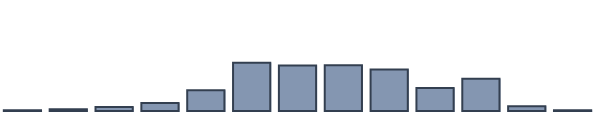
| Category | Series 0 |
|---|---|
| 0 | 0.227 |
| 1 | 0.606 |
| 2 | 1.439 |
| 3 | 2.879 |
| 4 | 7.5 |
| 5 | 17.424 |
| 6 | 16.439 |
| 7 | 16.515 |
| 8 | 15 |
| 9 | 8.333 |
| 10 | 11.667 |
| 11 | 1.742 |
| 12 | 0.227 |